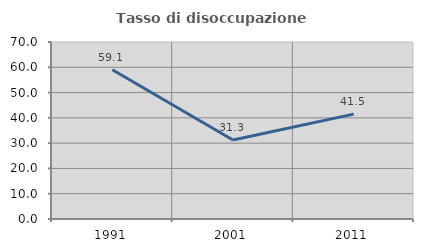
| Category | Tasso di disoccupazione giovanile  |
|---|---|
| 1991.0 | 59.052 |
| 2001.0 | 31.25 |
| 2011.0 | 41.463 |